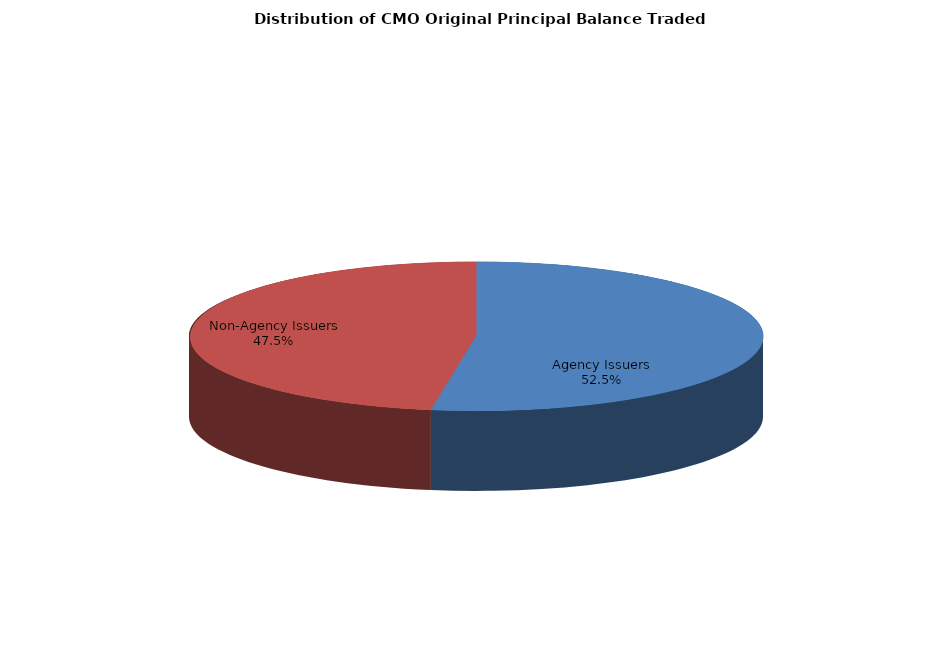
| Category | Series 0 |
|---|---|
| Agency Issuers | 6189749435.91 |
| Non-Agency Issuers | 5597896522.062 |